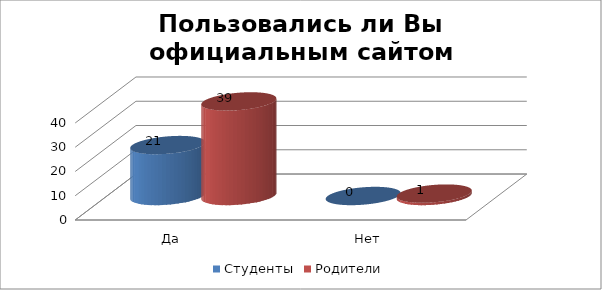
| Category | Студенты | Родители |
|---|---|---|
| Да | 21 | 39 |
| Нет | 0 | 1 |